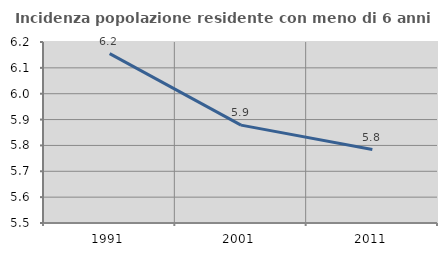
| Category | Incidenza popolazione residente con meno di 6 anni |
|---|---|
| 1991.0 | 6.155 |
| 2001.0 | 5.879 |
| 2011.0 | 5.784 |